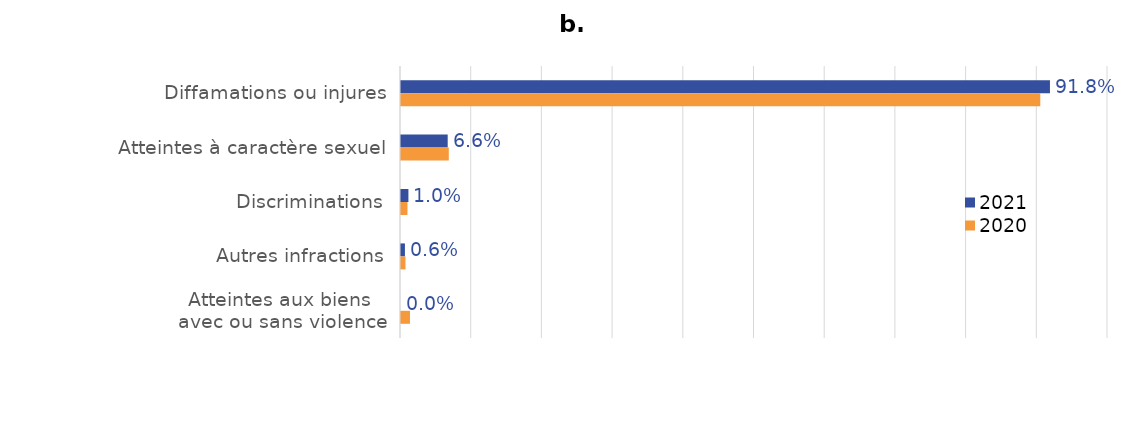
| Category | 2021 | 2020 |
|---|---|---|
| Diffamations ou injures | 0.918 | 0.904 |
| Atteintes à caractère sexuel | 0.066 | 0.068 |
| Discriminations | 0.01 | 0.009 |
| Autres infractions | 0.006 | 0.006 |
| Atteintes aux biens 
avec ou sans violence | 0 | 0.013 |